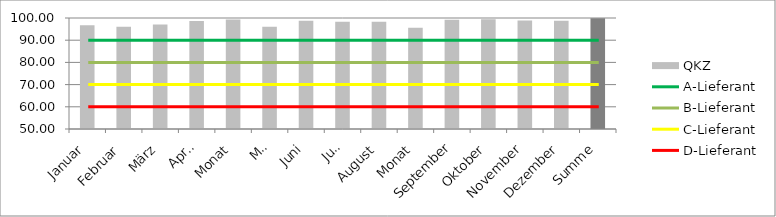
| Category | QKZ |
|---|---|
| Januar | 96.75 |
| Februar | 96.061 |
| März | 97.072 |
| April | 98.7 |
| Monat | 99.355 |
| Mai | 96.108 |
| Juni | 98.789 |
| Juli | 98.336 |
| August | 98.35 |
| Monat | 95.553 |
| September | 99.264 |
| Oktober | 99.414 |
| November | 98.872 |
| Dezember | 98.798 |
| Summe | 99.905 |